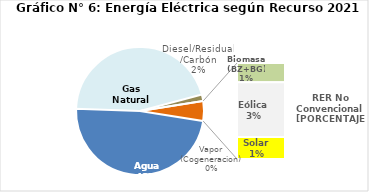
| Category | Series 0 |
|---|---|
| Agua | 2258.332 |
| Gas Natural | 2128.746 |
| Diesel/Residual/Carbón | 75.579 |
| Vapor (Cogeneracion) | 0.237 |
| Biomasa (BZ+BG) | 47.417 |
| Eólica | 134.653 |
| Solar | 54.278 |